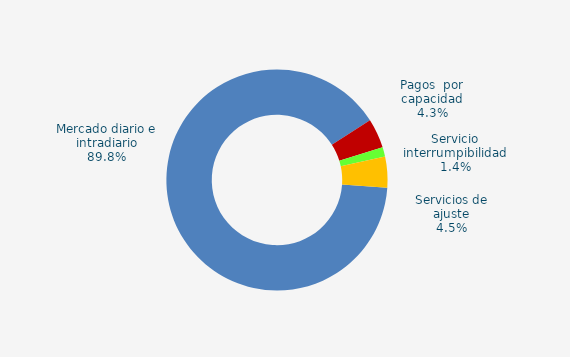
| Category | Series 0 |
|---|---|
| Mercado diario e intradiario | 50.89 |
| Pagos  por capacidad | 2.45 |
| Servicio interrumpibilidad | 0.78 |
| Servicios de ajuste | 2.56 |